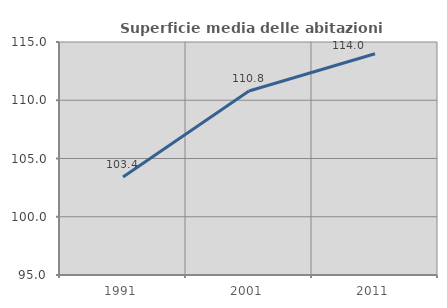
| Category | Superficie media delle abitazioni occupate |
|---|---|
| 1991.0 | 103.402 |
| 2001.0 | 110.793 |
| 2011.0 | 113.992 |